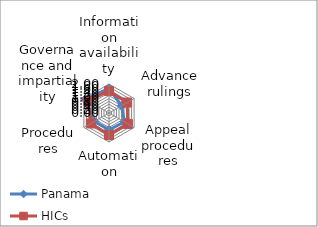
| Category | Panama | HICs |
|---|---|---|
| Information availability | 1.7 | 1.519 |
| Advance rulings | 1 | 1.443 |
| Appeal procedures | 1.222 | 1.506 |
| Automation | 1.167 | 1.521 |
| Procedures | 1.161 | 1.441 |
| Governance and impartiality | 1.889 | 1.662 |